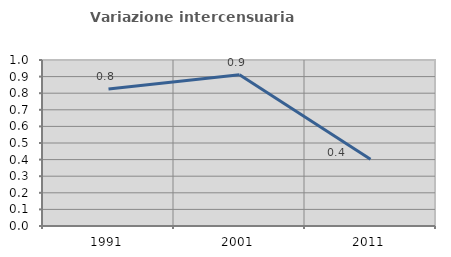
| Category | Variazione intercensuaria annua |
|---|---|
| 1991.0 | 0.825 |
| 2001.0 | 0.912 |
| 2011.0 | 0.402 |